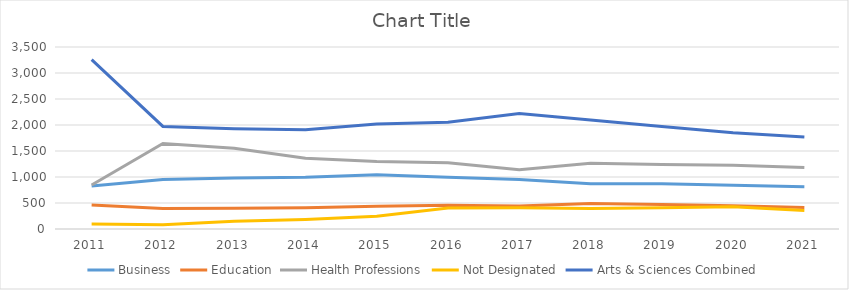
| Category | Business | Education | Health Professions | Not Designated | Arts & Sciences Combined |
|---|---|---|---|---|---|
| 2011.0 | 826 | 460 | 847 | 94 | 3258 |
| 2012.0 | 952 | 393 | 1646 | 84 | 1972 |
| 2013.0 | 981 | 401 | 1555 | 150 | 1928 |
| 2014.0 | 993 | 408 | 1361 | 183 | 1909 |
| 2015.0 | 1042 | 438 | 1298 | 246 | 2020 |
| 2016.0 | 997 | 457 | 1276 | 406 | 2052 |
| 2017.0 | 950 | 443 | 1141 | 408 | 2222 |
| 2018.0 | 870 | 491 | 1265 | 395 | 2097 |
| 2019.0 | 870 | 472 | 1239 | 410 | 1973 |
| 2020.0 | 840 | 448 | 1228 | 427 | 1851 |
| 2021.0 | 811 | 415 | 1184 | 357 | 1768 |